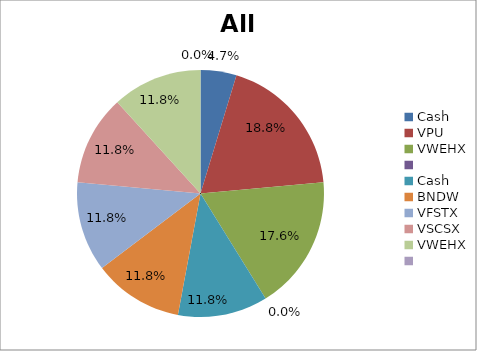
| Category | Series 0 |
|---|---|
| Cash | 0.047 |
| VPU | 0.188 |
| VWEHX | 0.176 |
|  | 0 |
| Cash | 0.118 |
| BNDW | 0.118 |
| VFSTX | 0.118 |
| VSCSX | 0.118 |
| VWEHX | 0.118 |